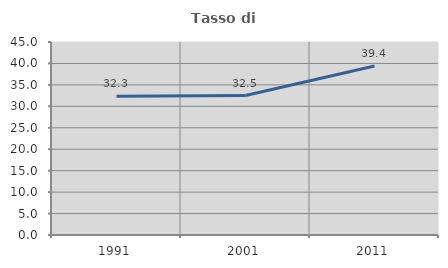
| Category | Tasso di occupazione   |
|---|---|
| 1991.0 | 32.331 |
| 2001.0 | 32.515 |
| 2011.0 | 39.386 |